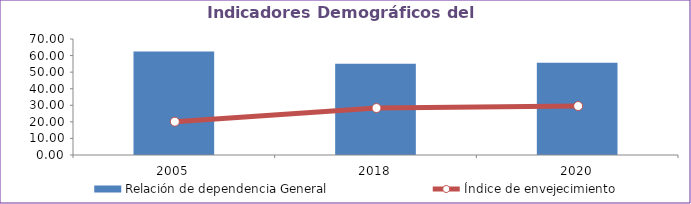
| Category | Relación de dependencia General |
|---|---|
| 2005.0 | 62.429 |
| 2018.0 | 55.066 |
| 2020.0 | 55.714 |